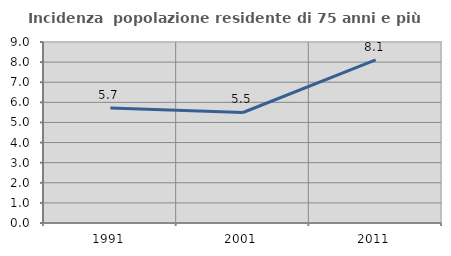
| Category | Incidenza  popolazione residente di 75 anni e più |
|---|---|
| 1991.0 | 5.714 |
| 2001.0 | 5.495 |
| 2011.0 | 8.108 |